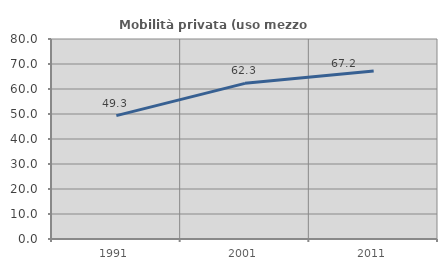
| Category | Mobilità privata (uso mezzo privato) |
|---|---|
| 1991.0 | 49.343 |
| 2001.0 | 62.267 |
| 2011.0 | 67.244 |